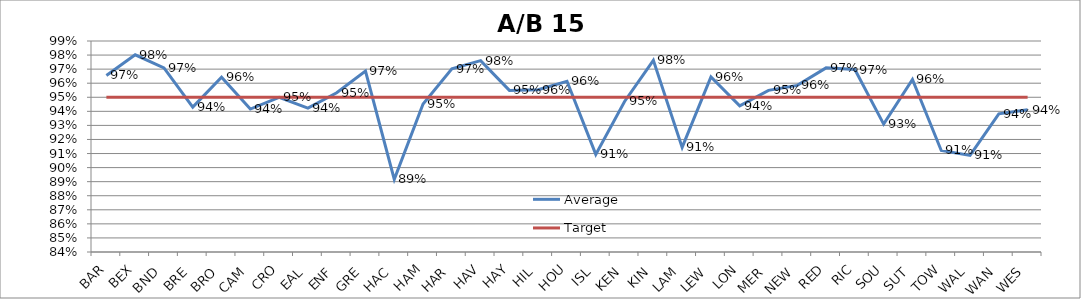
| Category | Average | Target |
|---|---|---|
| BAR | 0.965 | 0.95 |
| BEX | 0.98 | 0.95 |
| BND | 0.971 | 0.95 |
| BRE | 0.943 | 0.95 |
| BRO | 0.964 | 0.95 |
| CAM | 0.942 | 0.95 |
| CRO | 0.95 | 0.95 |
| EAL | 0.942 | 0.95 |
| ENF | 0.953 | 0.95 |
| GRE | 0.969 | 0.95 |
| HAC | 0.892 | 0.95 |
| HAM | 0.945 | 0.95 |
| HAR | 0.97 | 0.95 |
| HAV | 0.976 | 0.95 |
| HAY | 0.955 | 0.95 |
| HIL | 0.955 | 0.95 |
| HOU | 0.961 | 0.95 |
| ISL | 0.909 | 0.95 |
| KEN | 0.947 | 0.95 |
| KIN | 0.976 | 0.95 |
| LAM | 0.914 | 0.95 |
| LEW | 0.964 | 0.95 |
| LON | 0.944 | 0.95 |
| MER | 0.955 | 0.95 |
| NEW | 0.958 | 0.95 |
| RED | 0.971 | 0.95 |
| RIC | 0.97 | 0.95 |
| SOU | 0.931 | 0.95 |
| SUT | 0.963 | 0.95 |
| TOW | 0.912 | 0.95 |
| WAL | 0.909 | 0.95 |
| WAN | 0.938 | 0.95 |
| WES | 0.941 | 0.95 |